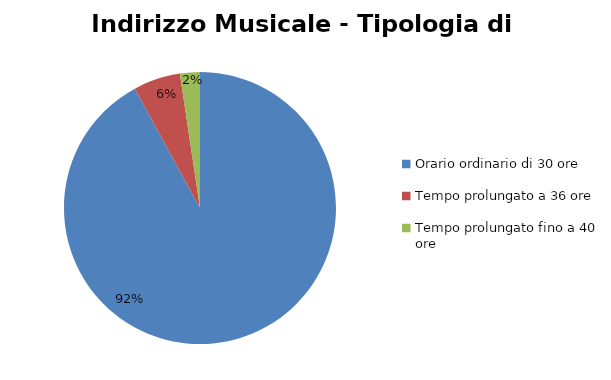
| Category | Series 0 | Series 1 |
|---|---|---|
| Orario ordinario di 30 ore | 2917 |  |
| Tempo prolungato a 36 ore | 177 |  |
| Tempo prolungato fino a 40 ore | 75 |  |